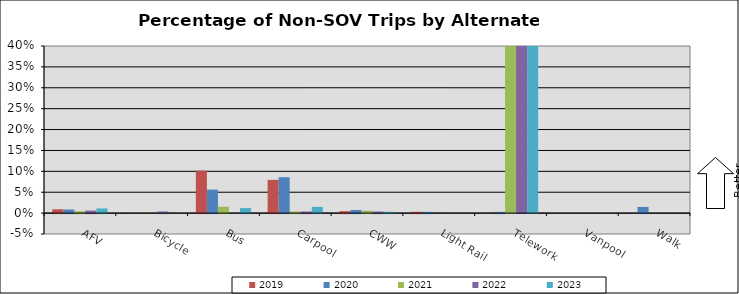
| Category | 2019 | 2020 | 2021 | 2022 | 2023 |
|---|---|---|---|---|---|
| AFV | 0.009 | 0.009 | 0.004 | 0.006 | 0.011 |
| Bicycle | 0 | 0 | 0 | 0.004 | 0 |
| Bus | 0.102 | 0.056 | 0.015 | 0 | 0.012 |
| Carpool | 0.079 | 0.086 | 0.004 | 0.004 | 0.015 |
| CWW | 0.005 | 0.007 | 0.006 | 0.004 | 0.003 |
| Light Rail | 0.003 | 0.003 | 0 | 0 | 0 |
| Telework | 0 | 0.003 | 0.576 | 0.735 | 0.82 |
| Vanpool | 0 | 0 | 0 | 0 | 0 |
| Walk | 0 | 0.015 | 0 | 0 | 0 |